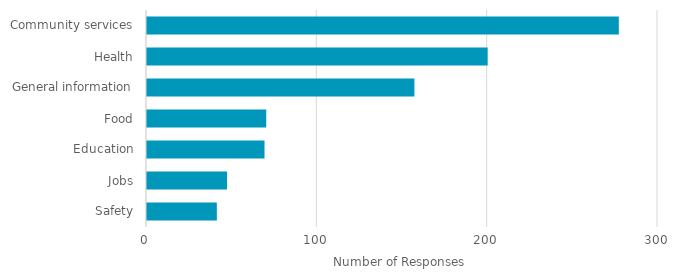
| Category | Series 0 |
|---|---|
| Safety | 41 |
| Jobs | 47 |
| Education | 69 |
| Food | 70 |
| General information | 157 |
| Health | 200 |
| Community services | 277 |